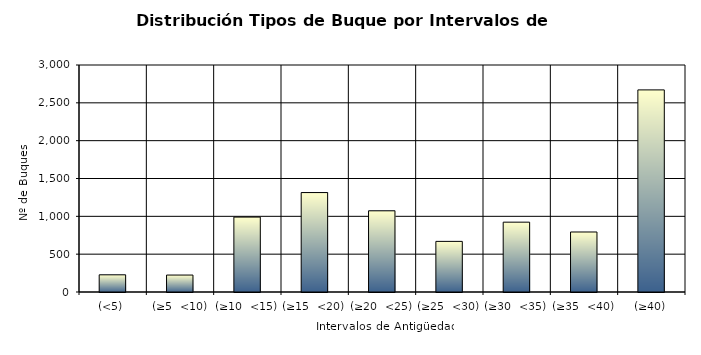
| Category | Series 0 |
|---|---|
| (<5) | 227 |
| (≥5  <10) | 224 |
| (≥10  <15) | 990 |
| (≥15  <20) | 1314 |
| (≥20  <25) | 1073 |
| (≥25  <30) | 669 |
| (≥30  <35) | 923 |
| (≥35  <40) | 793 |
| (≥40) | 2671 |